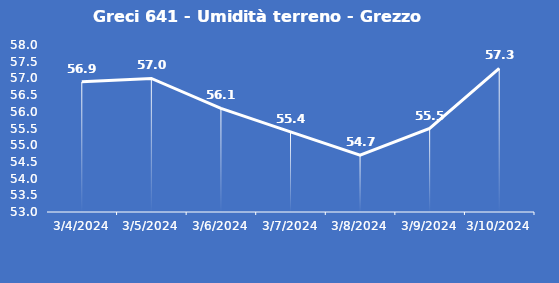
| Category | Greci 641 - Umidità terreno - Grezzo (%VWC) |
|---|---|
| 3/4/24 | 56.9 |
| 3/5/24 | 57 |
| 3/6/24 | 56.1 |
| 3/7/24 | 55.4 |
| 3/8/24 | 54.7 |
| 3/9/24 | 55.5 |
| 3/10/24 | 57.3 |